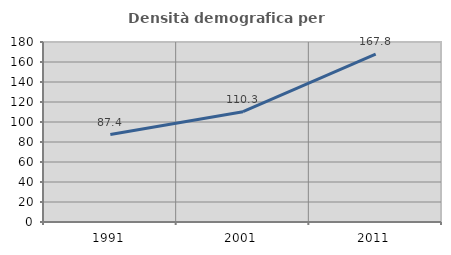
| Category | Densità demografica |
|---|---|
| 1991.0 | 87.41 |
| 2001.0 | 110.338 |
| 2011.0 | 167.822 |